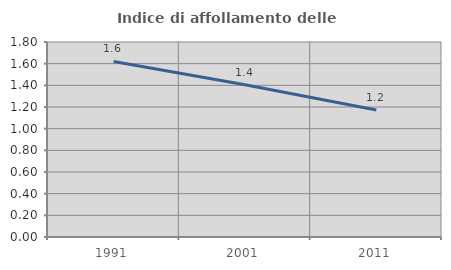
| Category | Indice di affollamento delle abitazioni  |
|---|---|
| 1991.0 | 1.62 |
| 2001.0 | 1.405 |
| 2011.0 | 1.172 |